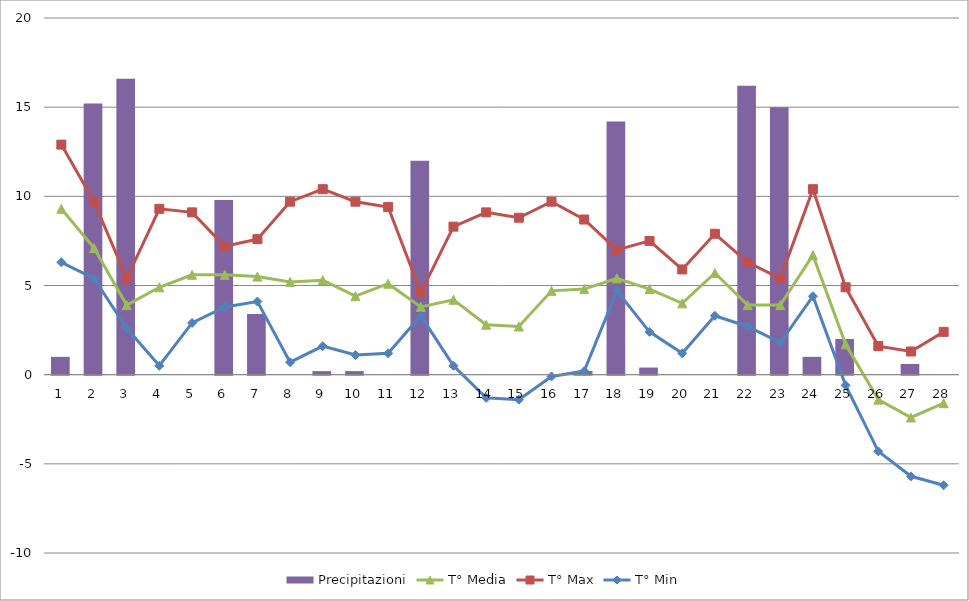
| Category | Precipitazioni |
|---|---|
| 0 | 1 |
| 1 | 15.2 |
| 2 | 16.6 |
| 3 | 0 |
| 4 | 0 |
| 5 | 9.8 |
| 6 | 3.4 |
| 7 | 0 |
| 8 | 0.2 |
| 9 | 0.2 |
| 10 | 0 |
| 11 | 12 |
| 12 | 0 |
| 13 | 0 |
| 14 | 0 |
| 15 | 0 |
| 16 | 0.2 |
| 17 | 14.2 |
| 18 | 0.4 |
| 19 | 0 |
| 20 | 0 |
| 21 | 16.2 |
| 22 | 15 |
| 23 | 1 |
| 24 | 2 |
| 25 | 0 |
| 26 | 0.6 |
| 27 | 0 |